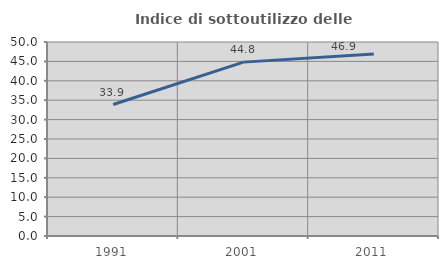
| Category | Indice di sottoutilizzo delle abitazioni  |
|---|---|
| 1991.0 | 33.883 |
| 2001.0 | 44.813 |
| 2011.0 | 46.937 |